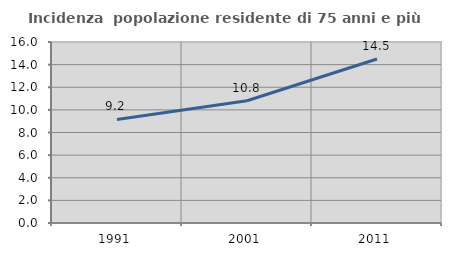
| Category | Incidenza  popolazione residente di 75 anni e più |
|---|---|
| 1991.0 | 9.151 |
| 2001.0 | 10.805 |
| 2011.0 | 14.499 |